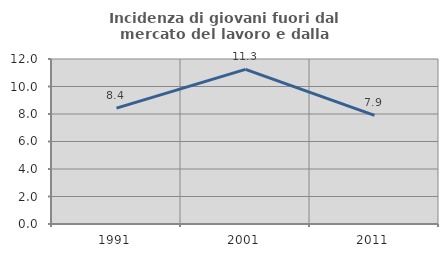
| Category | Incidenza di giovani fuori dal mercato del lavoro e dalla formazione  |
|---|---|
| 1991.0 | 8.426 |
| 2001.0 | 11.25 |
| 2011.0 | 7.895 |